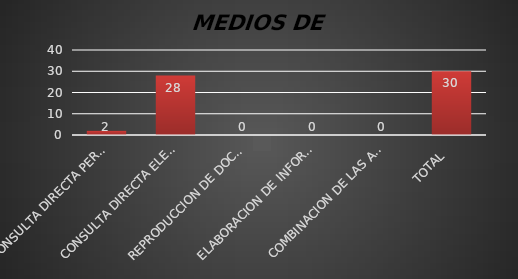
| Category | Series 1 |
|---|---|
| CONSULTA DIRECTA PERSONAL | 2 |
| CONSULTA DIRECTA ELECTRONICA | 28 |
| REPRODUCCION DE DOCUMENTOS  | 0 |
| ELABORACION DE INFORMES ESPECIFICOS  | 0 |
| COMBINACION DE LAS ANTERIORES | 0 |
| TOTAL  | 30 |